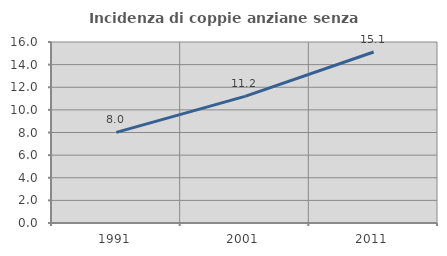
| Category | Incidenza di coppie anziane senza figli  |
|---|---|
| 1991.0 | 8.012 |
| 2001.0 | 11.196 |
| 2011.0 | 15.113 |